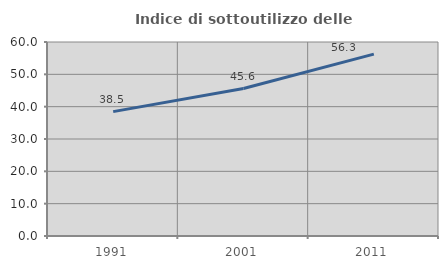
| Category | Indice di sottoutilizzo delle abitazioni  |
|---|---|
| 1991.0 | 38.462 |
| 2001.0 | 45.614 |
| 2011.0 | 56.25 |